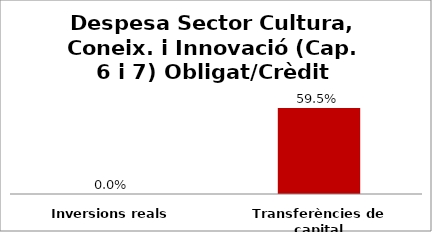
| Category | Series 0 |
|---|---|
| Inversions reals | 0 |
| Transferències de capital | 0.595 |